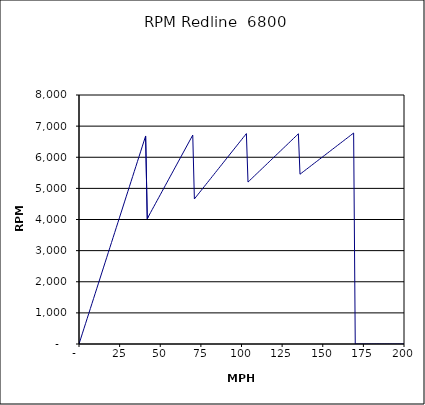
| Category | RPM Redline  6800 |
|---|---|
| 0.0 | 0 |
| 1.0 | 163.016 |
| 2.0 | 326.032 |
| 3.0 | 489.048 |
| 4.0 | 652.064 |
| 5.0 | 815.08 |
| 6.0 | 978.096 |
| 7.0 | 1141.112 |
| 8.0 | 1304.129 |
| 9.0 | 1467.145 |
| 10.0 | 1630.161 |
| 11.0 | 1793.177 |
| 12.0 | 1956.193 |
| 13.0 | 2119.209 |
| 14.0 | 2282.225 |
| 15.0 | 2445.241 |
| 16.0 | 2608.257 |
| 17.0 | 2771.273 |
| 18.0 | 2934.289 |
| 19.0 | 3097.305 |
| 20.0 | 3260.321 |
| 21.0 | 3423.337 |
| 22.0 | 3586.353 |
| 23.0 | 3749.37 |
| 24.0 | 3912.386 |
| 25.0 | 4075.402 |
| 26.0 | 4238.418 |
| 27.0 | 4401.434 |
| 28.0 | 4564.45 |
| 29.0 | 4727.466 |
| 30.0 | 4890.482 |
| 31.0 | 5053.498 |
| 32.0 | 5216.514 |
| 33.0 | 5379.53 |
| 34.0 | 5542.546 |
| 35.0 | 5705.562 |
| 36.0 | 5868.578 |
| 37.0 | 6031.595 |
| 38.0 | 6194.611 |
| 39.0 | 6357.627 |
| 40.0 | 6520.643 |
| 41.0 | 6683.659 |
| 42.0 | 4027.456 |
| 43.0 | 4123.348 |
| 44.0 | 4219.239 |
| 45.0 | 4315.131 |
| 46.0 | 4411.023 |
| 47.0 | 4506.915 |
| 48.0 | 4602.807 |
| 49.0 | 4698.698 |
| 50.0 | 4794.59 |
| 51.0 | 4890.482 |
| 52.0 | 4986.374 |
| 53.0 | 5082.266 |
| 54.0 | 5178.157 |
| 55.0 | 5274.049 |
| 56.0 | 5369.941 |
| 57.0 | 5465.833 |
| 58.0 | 5561.725 |
| 59.0 | 5657.616 |
| 60.0 | 5753.508 |
| 61.0 | 5849.4 |
| 62.0 | 5945.292 |
| 63.0 | 6041.184 |
| 64.0 | 6137.075 |
| 65.0 | 6232.967 |
| 66.0 | 6328.859 |
| 67.0 | 6424.751 |
| 68.0 | 6520.643 |
| 69.0 | 6616.535 |
| 70.0 | 6712.426 |
| 71.0 | 4659.719 |
| 72.0 | 4725.349 |
| 73.0 | 4790.979 |
| 74.0 | 4856.609 |
| 75.0 | 4922.238 |
| 76.0 | 4987.868 |
| 77.0 | 5053.498 |
| 78.0 | 5119.128 |
| 79.0 | 5184.758 |
| 80.0 | 5250.388 |
| 81.0 | 5316.017 |
| 82.0 | 5381.647 |
| 83.0 | 5447.277 |
| 84.0 | 5512.907 |
| 85.0 | 5578.537 |
| 86.0 | 5644.167 |
| 87.0 | 5709.797 |
| 88.0 | 5775.426 |
| 89.0 | 5841.056 |
| 90.0 | 5906.686 |
| 91.0 | 5972.316 |
| 92.0 | 6037.946 |
| 93.0 | 6103.576 |
| 94.0 | 6169.205 |
| 95.0 | 6234.835 |
| 96.0 | 6300.465 |
| 97.0 | 6366.095 |
| 98.0 | 6431.725 |
| 99.0 | 6497.355 |
| 100.0 | 6562.985 |
| 101.0 | 6628.614 |
| 102.0 | 6694.244 |
| 103.0 | 6759.874 |
| 104.0 | 5202.714 |
| 105.0 | 5252.74 |
| 106.0 | 5302.766 |
| 107.0 | 5352.792 |
| 108.0 | 5402.818 |
| 109.0 | 5452.844 |
| 110.0 | 5502.87 |
| 111.0 | 5552.897 |
| 112.0 | 5602.923 |
| 113.0 | 5652.949 |
| 114.0 | 5702.975 |
| 115.0 | 5753.001 |
| 116.0 | 5803.027 |
| 117.0 | 5853.053 |
| 118.0 | 5903.079 |
| 119.0 | 5953.105 |
| 120.0 | 6003.131 |
| 121.0 | 6053.157 |
| 122.0 | 6103.184 |
| 123.0 | 6153.21 |
| 124.0 | 6203.236 |
| 125.0 | 6253.262 |
| 126.0 | 6303.288 |
| 127.0 | 6353.314 |
| 128.0 | 6403.34 |
| 129.0 | 6453.366 |
| 130.0 | 6503.392 |
| 131.0 | 6553.418 |
| 132.0 | 6603.445 |
| 133.0 | 6653.471 |
| 134.0 | 6703.497 |
| 135.0 | 6753.523 |
| 136.0 | 5454.569 |
| 137.0 | 5494.677 |
| 138.0 | 5534.784 |
| 139.0 | 5574.891 |
| 140.0 | 5614.998 |
| 141.0 | 5655.105 |
| 142.0 | 5695.212 |
| 143.0 | 5735.319 |
| 144.0 | 5775.426 |
| 145.0 | 5815.534 |
| 146.0 | 5855.641 |
| 147.0 | 5895.748 |
| 148.0 | 5935.855 |
| 149.0 | 5975.962 |
| 150.0 | 6016.069 |
| 151.0 | 6056.176 |
| 152.0 | 6096.283 |
| 153.0 | 6136.391 |
| 154.0 | 6176.498 |
| 155.0 | 6216.605 |
| 156.0 | 6256.712 |
| 157.0 | 6296.819 |
| 158.0 | 6336.926 |
| 159.0 | 6377.033 |
| 160.0 | 6417.14 |
| 161.0 | 6457.248 |
| 162.0 | 6497.355 |
| 163.0 | 6537.462 |
| 164.0 | 6577.569 |
| 165.0 | 6617.676 |
| 166.0 | 6657.783 |
| 167.0 | 6697.89 |
| 168.0 | 6737.997 |
| 169.0 | 6778.105 |
| 170.0 | 0 |
| 171.0 | 0 |
| 172.0 | 0 |
| 173.0 | 0 |
| 174.0 | 0 |
| 175.0 | 0 |
| 176.0 | 0 |
| 177.0 | 0 |
| 178.0 | 0 |
| 179.0 | 0 |
| 180.0 | 0 |
| 181.0 | 0 |
| 182.0 | 0 |
| 183.0 | 0 |
| 184.0 | 0 |
| 185.0 | 0 |
| 186.0 | 0 |
| 187.0 | 0 |
| 188.0 | 0 |
| 189.0 | 0 |
| 190.0 | 0 |
| 191.0 | 0 |
| 192.0 | 0 |
| 193.0 | 0 |
| 194.0 | 0 |
| 195.0 | 0 |
| 196.0 | 0 |
| 197.0 | 0 |
| 198.0 | 0 |
| 199.0 | 0 |
| 200.0 | 0 |